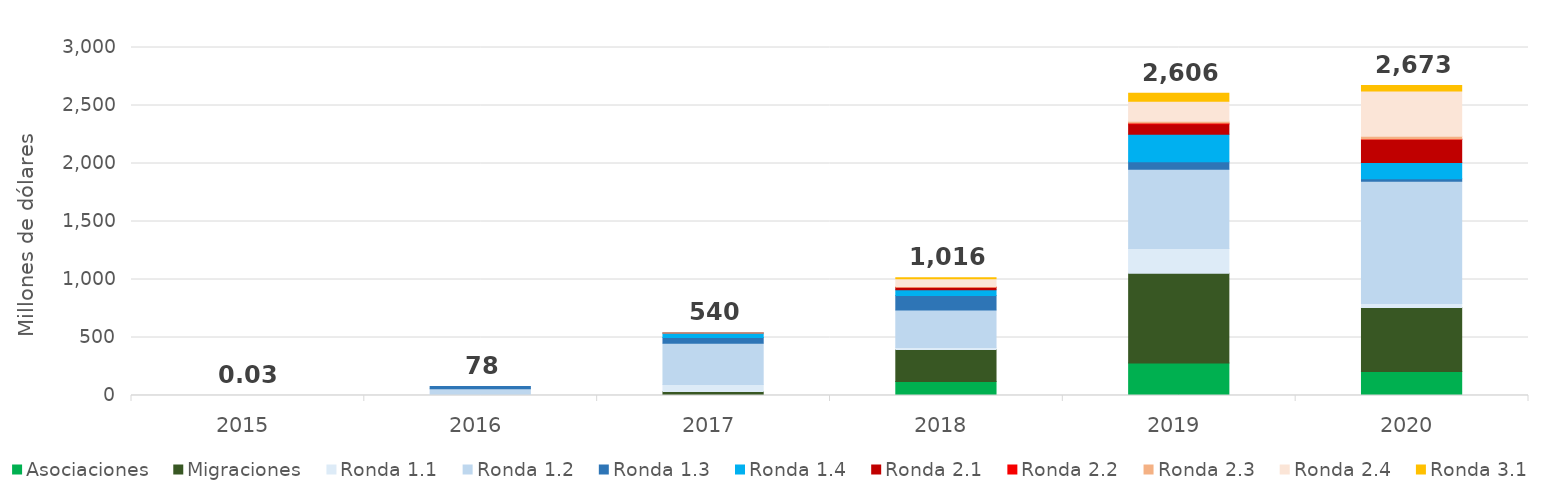
| Category | Asociaciones | Migraciones | Ronda 1.1 | Ronda 1.2 | Ronda 1.3 | Ronda 1.4 | Ronda 2.1 | Ronda 2.2 | Ronda 2.3 | Ronda 2.4 | Ronda 3.1 |
|---|---|---|---|---|---|---|---|---|---|---|---|
| 2015.0 | 0 | 0 | 0.023 | 0.003 | 0 | 0 | 0 | 0 | 0 | 0 | 0 |
| 2016.0 | 0 | 0 | 7.936 | 50.902 | 19.085 | 0 | 0 | 0 | 0 | 0 | 0 |
| 2017.0 | 1.551 | 32.93 | 60.276 | 356.292 | 49.073 | 38.707 | 0.93 | 0 | 0.096 | 0 | 0 |
| 2018.0 | 121.371 | 276.221 | 16.154 | 323.201 | 126.084 | 47.616 | 21.584 | 0.843 | 6.737 | 66.16 | 9.669 |
| 2019.0 | 280.617 | 772.208 | 213.486 | 685.106 | 64.331 | 235.595 | 88.72 | 9.392 | 14.554 | 173.042 | 69.349 |
| 2020.0 | 207.71 | 550.505 | 33.998 | 1054.149 | 22.253 | 140.295 | 198.226 | 3.04 | 23.885 | 391.695 | 46.857 |